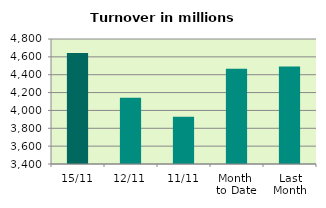
| Category | Series 0 |
|---|---|
| 15/11 | 4641.987 |
| 12/11 | 4142.621 |
| 11/11 | 3928.88 |
| Month 
to Date | 4465.852 |
| Last
Month | 4491.272 |